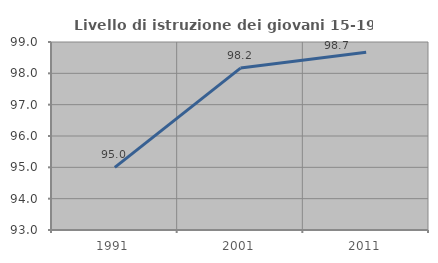
| Category | Livello di istruzione dei giovani 15-19 anni |
|---|---|
| 1991.0 | 95 |
| 2001.0 | 98.168 |
| 2011.0 | 98.675 |